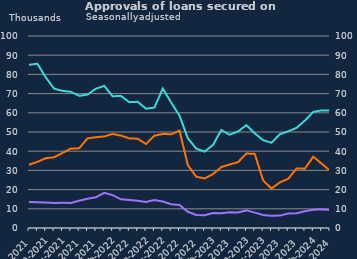
| Category | Remortgaging | Other |
|---|---|---|
| Apr-2021 | 32963 | 13562 |
| May-2021 | 34425 | 13476 |
| Jun-2021 | 36340 | 13345 |
| Jul-2021 | 36837 | 13085 |
| Aug-2021 | 39087 | 13102 |
| Sep-2021 | 41344 | 13059 |
| Oct-2021 | 41500 | 14218 |
| Nov-2021 | 46683 | 15205 |
| Dec-2021 | 47294 | 16050 |
| Jan-2022 | 47657 | 18283 |
| Feb-2022 | 48981 | 17111 |
| Mar-2022 | 48138 | 14911 |
| Apr-2022 | 46669 | 14581 |
| May-2022 | 46500 | 14140 |
| Jun-2022 | 43751 | 13520 |
| Jul-2022 | 48105 | 14585 |
| Aug-2022 | 48948 | 13783 |
| Sep-2022 | 48844 | 12389 |
| Oct-2022 | 50700 | 12003 |
| Nov-2022 | 32716 | 8446 |
| Dec-2022 | 26725 | 6793 |
| Jan-2023 | 25804 | 6658 |
| Feb-2023 | 28074 | 7823 |
| Mar-2023 | 31730 | 7744 |
| Apr-2023 | 33087 | 8171 |
| May-2023 | 34296 | 8099 |
| Jun-2023 | 38787 | 9164 |
| Jul-2023 | 38612 | 8001 |
| Aug-2023 | 24813 | 6778 |
| Sep-2023 | 20535 | 6430 |
| Oct-2023 | 23744 | 6447 |
| Nov-2023 | 25634 | 7532 |
| Dec-2023 | 30965 | 7688 |
| Jan-2024 | 30912 | 8730 |
| Feb-2024 | 37159 | 9463 |
| Mar-2024 | 33526 | 9717 |
| Apr-2024 | 29867 | 9348 |